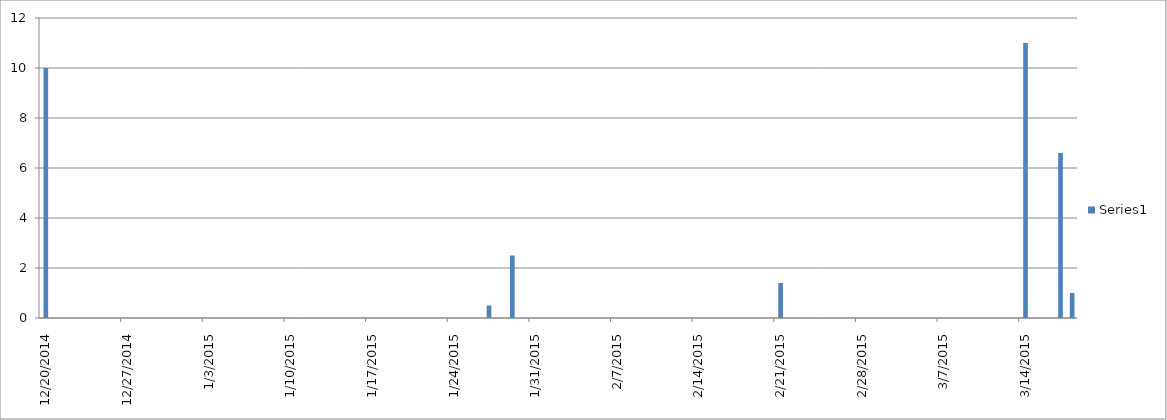
| Category | Series 0 |
|---|---|
| 12/20/14 | 10 |
| 1/27/15 | 0.5 |
| 1/29/15 | 2.5 |
| 2/21/15 | 1.4 |
| 3/14/15 | 11 |
| 3/17/15 | 6.6 |
| 3/18/15 | 1 |